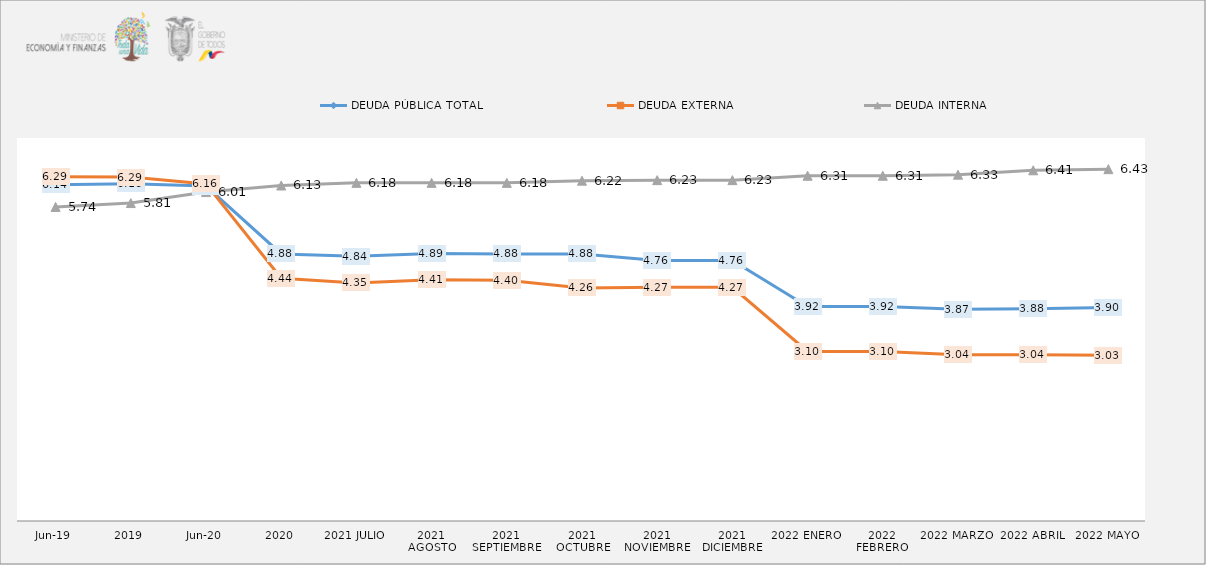
| Category | DEUDA PÚBLICA TOTAL | DEUDA EXTERNA  | DEUDA INTERNA |
|---|---|---|---|
| jun-19 | 6.143 | 6.29 | 5.74 |
| 2019 | 6.164 | 6.285 | 5.811 |
| jun-20 | 6.121 | 6.161 | 6.012 |
| 2020 | 4.881 | 4.437 | 6.132 |
| 2021 JULIO | 4.84 | 4.351 | 6.18 |
| 2021 AGOSTO | 4.89 | 4.41 | 6.18 |
| 2021 SEPTIEMBRE | 4.88 | 4.4 | 6.18 |
| 2021 OCTUBRE | 4.88 | 4.26 | 6.22 |
| 2021 NOVIEMBRE | 4.76 | 4.27 | 6.23 |
| 2021 DICIEMBRE | 4.76 | 4.27 | 6.23 |
| 2022 ENERO | 3.92 | 3.1 | 6.31 |
| 2022 FEBRERO | 3.92 | 3.1 | 6.31 |
| 2022 MARZO | 3.87 | 3.04 | 6.33 |
| 2022 ABRIL | 3.88 | 3.04 | 6.41 |
| 2022 MAYO | 3.9 | 3.03 | 6.43 |